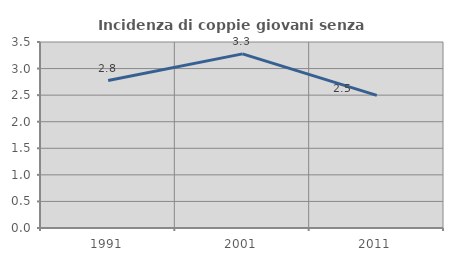
| Category | Incidenza di coppie giovani senza figli |
|---|---|
| 1991.0 | 2.775 |
| 2001.0 | 3.277 |
| 2011.0 | 2.495 |